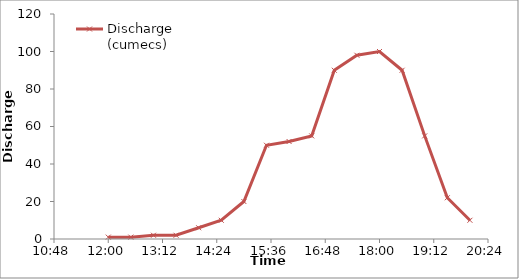
| Category | Discharge (cumecs) |
|---|---|
| 0.5 | 1 |
| 0.5208333333333334 | 1 |
| 0.5416666666666666 | 2 |
| 0.5625 | 2 |
| 0.5833333333333334 | 6 |
| 0.604166666666667 | 10 |
| 0.625 | 20 |
| 0.645833333333333 | 50 |
| 0.666666666666667 | 52 |
| 0.6875 | 55 |
| 0.708333333333334 | 90 |
| 0.729166666666667 | 98 |
| 0.75 | 100 |
| 0.770833333333334 | 90 |
| 0.791666666666667 | 55 |
| 0.8125 | 22 |
| 0.833333333333334 | 10 |